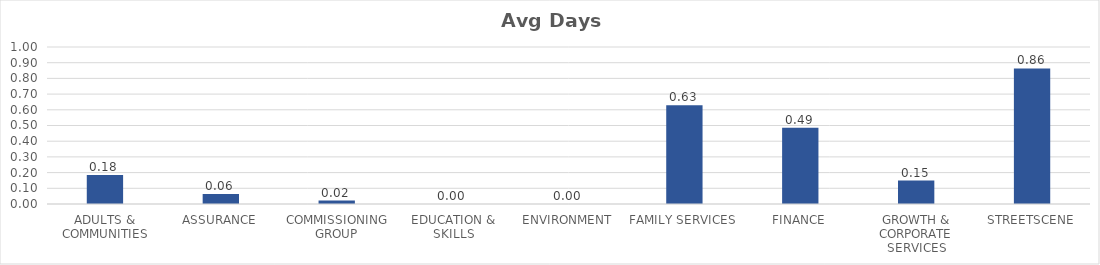
| Category | Avg Days Lost/FTE |
|---|---|
| ADULTS & COMMUNITIES | 0.184 |
| ASSURANCE | 0.064 |
| COMMISSIONING GROUP | 0.022 |
| EDUCATION & SKILLS | 0 |
| ENVIRONMENT | 0 |
| FAMILY SERVICES | 0.629 |
| FINANCE | 0.486 |
| GROWTH & CORPORATE SERVICES | 0.149 |
| STREETSCENE | 0.863 |